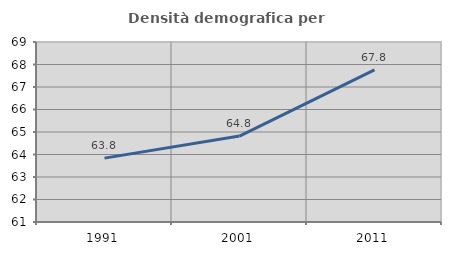
| Category | Densità demografica |
|---|---|
| 1991.0 | 63.84 |
| 2001.0 | 64.82 |
| 2011.0 | 67.76 |